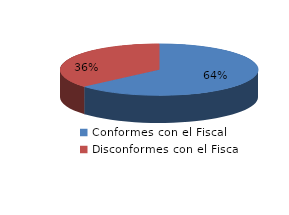
| Category | Series 0 |
|---|---|
| 0 | 1916 |
| 1 | 1100 |